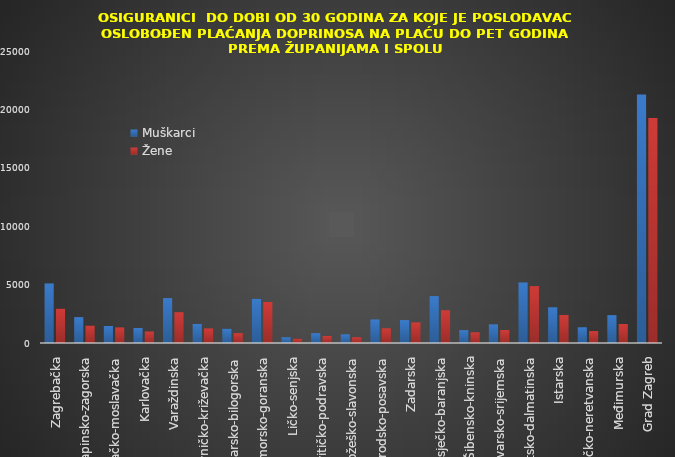
| Category | Muškarci | Žene |
|---|---|---|
| Zagrebačka | 5103 | 2936 |
| Krapinsko-zagorska | 2214 | 1495 |
| Sisačko-moslavačka | 1456 | 1336 |
| Karlovačka | 1283 | 986 |
| Varaždinska | 3844 | 2638 |
| Koprivničko-križevačka | 1634 | 1249 |
| Bjelovarsko-bilogorska | 1224 | 850 |
| Primorsko-goranska | 3785 | 3509 |
| Ličko-senjska | 494 | 380 |
| Virovitičko-podravska | 841 | 605 |
| Požeško-slavonska | 745 | 496 |
| Brodsko-posavska | 2018 | 1259 |
| Zadarska | 1964 | 1767 |
| Osječko-baranjska | 4015 | 2807 |
| Šibensko-kninska | 1101 | 918 |
| Vukovarsko-srijemska | 1595 | 1116 |
| Splitsko-dalmatinska | 5185 | 4867 |
| Istarska | 3057 | 2396 |
| Dubrovačko-neretvanska | 1348 | 1022 |
| Međimurska | 2385 | 1623 |
| Grad Zagreb | 21279 | 19267 |